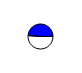
| Category | Series 0 |
|---|---|
| 0 | 21760 |
| 1 | 20756 |